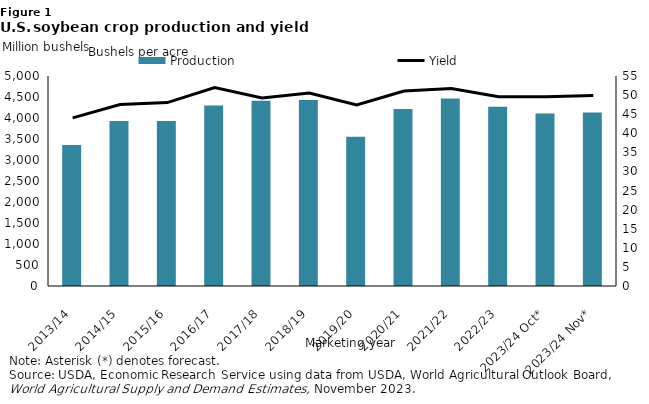
| Category | Production |
|---|---|
| 2013/14 | 3357.004 |
| 2014/15 | 3928.07 |
| 2015/16 | 3926.779 |
| 2016/17 | 4296.496 |
| 2017/18 | 4411.633 |
| 2018/19 | 4428.15 |
| 2019/20 | 3551.908 |
| 2020/21 | 4216.302 |
| 2021/22 | 4465.382 |
| 2022/23 | 4270.196 |
| 2023/24 Oct* | 4104.379 |
| 2023/24 Nov* | 4129.449 |